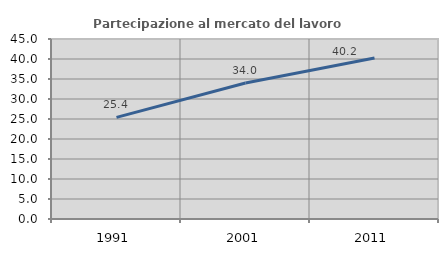
| Category | Partecipazione al mercato del lavoro  femminile |
|---|---|
| 1991.0 | 25.397 |
| 2001.0 | 34.008 |
| 2011.0 | 40.244 |